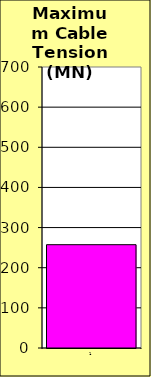
| Category | Series 0 |
|---|---|
| 0 | 257.332 |